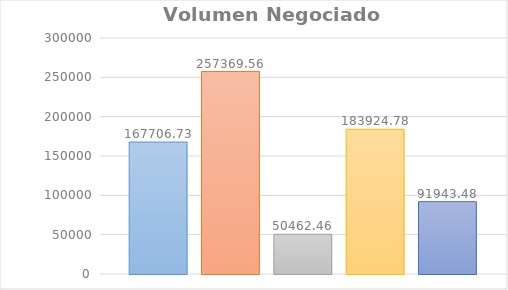
| Category | Lunes | Martes | Miercoles | Jueves | Viernes |
|---|---|---|---|---|---|
| 0 | 167706.73 | 257369.56 | 50462.46 | 183924.78 | 91943.48 |